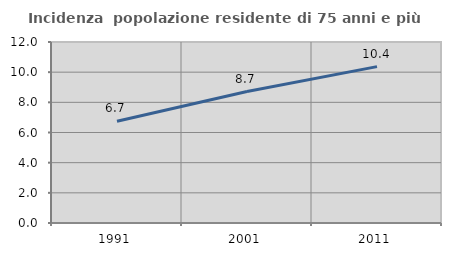
| Category | Incidenza  popolazione residente di 75 anni e più |
|---|---|
| 1991.0 | 6.749 |
| 2001.0 | 8.718 |
| 2011.0 | 10.366 |